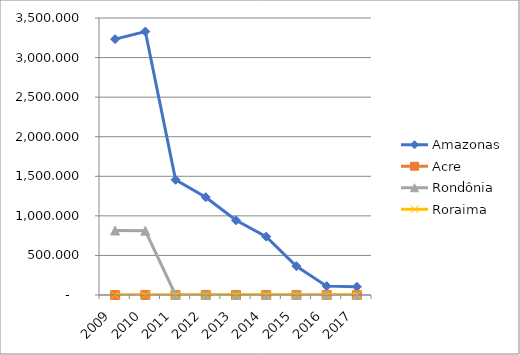
| Category | Amazonas | Acre | Rondônia | Roraima |
|---|---|---|---|---|
| 2009.0 | 3232.915 | 0 | 814.516 | 0.092 |
| 2010.0 | 3328.645 | 0.411 | 811.841 | 0 |
| 2011.0 | 1455.732 | 0 | 0 | 0.642 |
| 2012.0 | 1235.632 | 0.976 | 0 | 1.119 |
| 2013.0 | 944.269 | 0 | 0 | 2.18 |
| 2014.0 | 737.788 | 0 | 0 | 1.759 |
| 2015.0 | 363.86 | 0 | 0 | 0 |
| 2016.0 | 112.088 | 0 | 0 | 0 |
| 2017.0 | 103.938 | 0 | 0 | 2.36 |